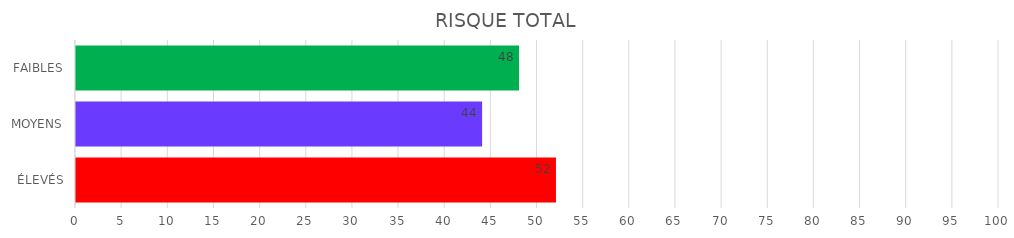
| Category | Series 1 | Series 0 |
|---|---|---|
| ÉLEVÉS | 52 | 52 |
| MOYENS | 44 | 44 |
| FAIBLES | 48 | 48 |